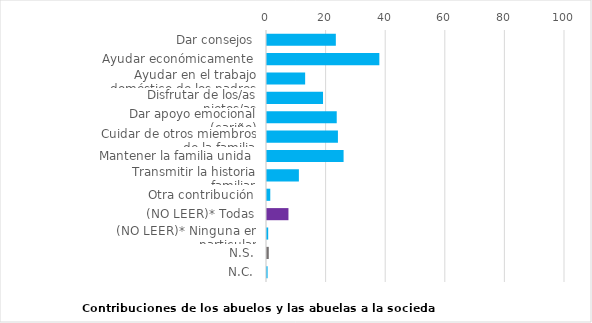
| Category | Series 0 |
|---|---|
| Dar consejos | 23.1 |
| Ayudar económicamente | 37.7 |
| Ayudar en el trabajo doméstico de los padres | 12.8 |
| Disfrutar de los/as nietos/as | 18.8 |
| Dar apoyo emocional (cariño) | 23.4 |
| Cuidar de otros miembros de la familia | 23.8 |
| Mantener la familia unida | 25.7 |
| Transmitir la historia familiar | 10.7 |
| Otra contribución | 1.1 |
| (NO LEER)* Todas | 7.2 |
| (NO LEER)* Ninguna en particular | 0.4 |
| N.S. | 0.6 |
| N.C. | 0.2 |